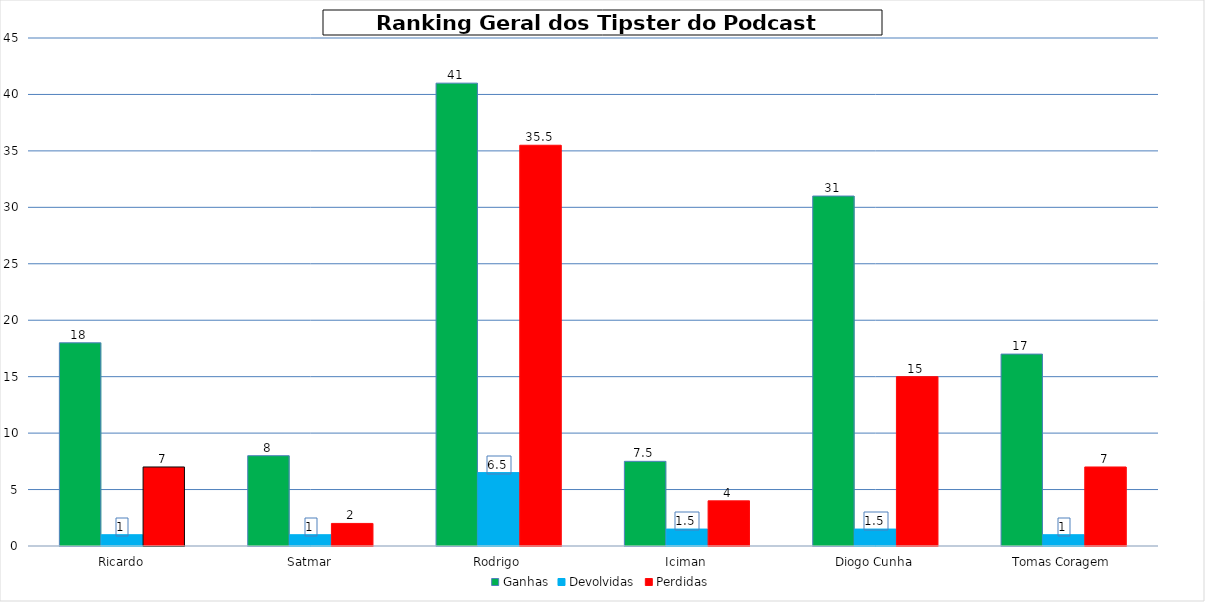
| Category | Ganhas | Devolvidas | Perdidas |
|---|---|---|---|
| Ricardo | 18 | 1 | 7 |
| Satmar | 8 | 1 | 2 |
| Rodrigo | 41 | 6.5 | 35.5 |
| Iciman | 7.5 | 1.5 | 4 |
| Diogo Cunha | 31 | 1.5 | 15 |
| Tomas Coragem | 17 | 1 | 7 |